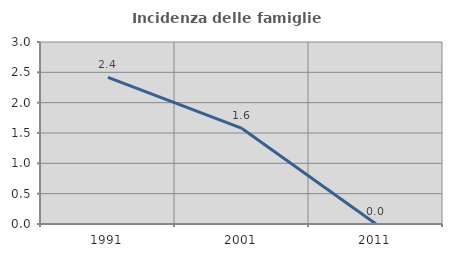
| Category | Incidenza delle famiglie numerose |
|---|---|
| 1991.0 | 2.415 |
| 2001.0 | 1.575 |
| 2011.0 | 0 |